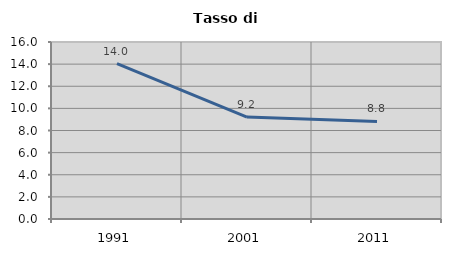
| Category | Tasso di disoccupazione   |
|---|---|
| 1991.0 | 14.04 |
| 2001.0 | 9.218 |
| 2011.0 | 8.824 |